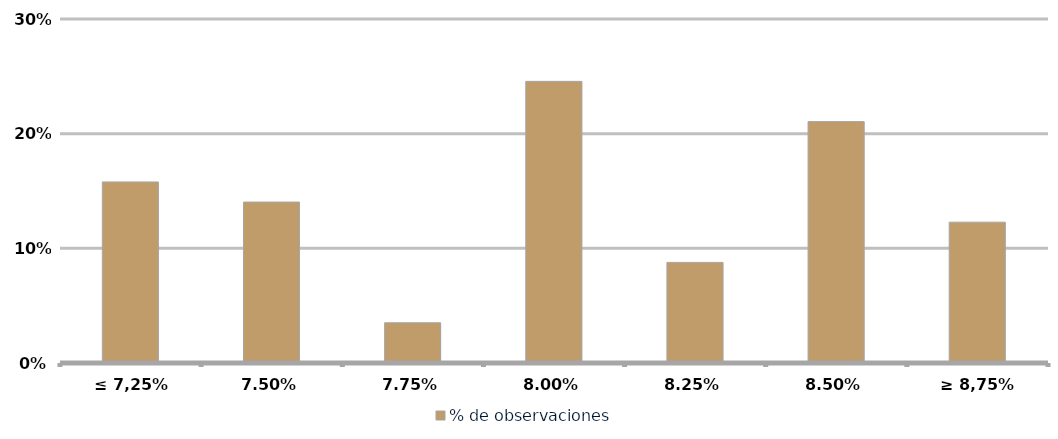
| Category | % de observaciones  |
|---|---|
| ≤ 7,25% | 0.158 |
| 7,50% | 0.14 |
| 7,75% | 0.035 |
| 8,00% | 0.246 |
| 8,25% | 0.088 |
| 8,50% | 0.211 |
| ≥ 8,75% | 0.123 |